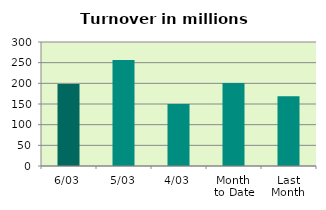
| Category | Series 0 |
|---|---|
| 6/03 | 198.334 |
| 5/03 | 256.535 |
| 4/03 | 150.009 |
| Month 
to Date | 200.704 |
| Last
Month | 168.971 |